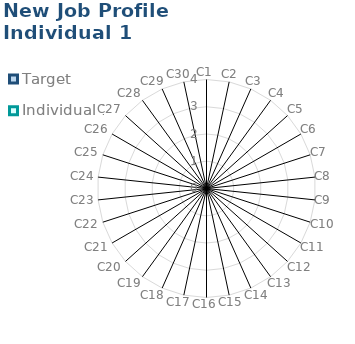
| Category | Target | Individual 1 |
|---|---|---|
| C1 | 0 | 0 |
| C2 | 0 | 0 |
| C3 | 0 | 0 |
| C4 | 0 | 0 |
| C5 | 0 | 0 |
| C6 | 0 | 0 |
| C7 | 0 | 0 |
| C8 | 0 | 0 |
| C9 | 0 | 0 |
| C10 | 0 | 0 |
| C11 | 0 | 0 |
| C12 | 0 | 0 |
| C13 | 0 | 0 |
| C14 | 0 | 0 |
| C15 | 0 | 0 |
| C16 | 0 | 0 |
| C17 | 0 | 0 |
| C18 | 0 | 0 |
| C19 | 0 | 0 |
| C20 | 0 | 0 |
| C21 | 0 | 0 |
| C22 | 0 | 0 |
| C23 | 0 | 0 |
| C24 | 0 | 0 |
| C25 | 0 | 0 |
| C26 | 0 | 0 |
| C27 | 0 | 0 |
| C28 | 0 | 0 |
| C29 | 0 | 0 |
| C30 | 0 | 0 |